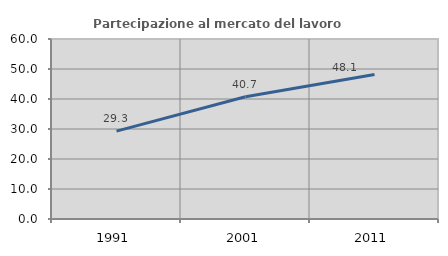
| Category | Partecipazione al mercato del lavoro  femminile |
|---|---|
| 1991.0 | 29.302 |
| 2001.0 | 40.741 |
| 2011.0 | 48.138 |